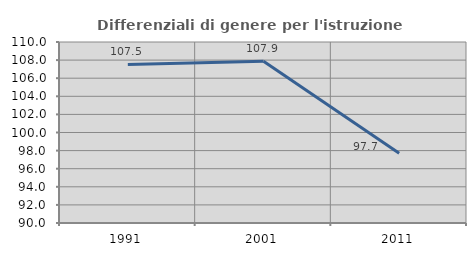
| Category | Differenziali di genere per l'istruzione superiore |
|---|---|
| 1991.0 | 107.526 |
| 2001.0 | 107.873 |
| 2011.0 | 97.701 |